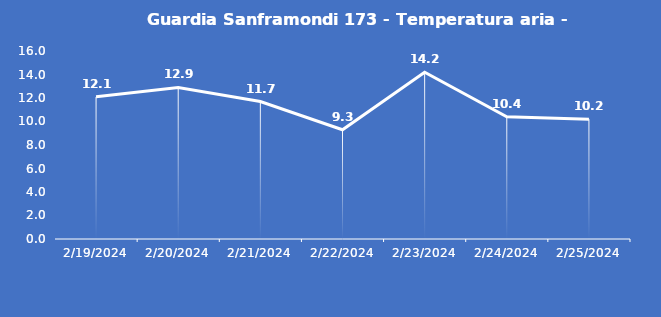
| Category | Guardia Sanframondi 173 - Temperatura aria - Grezzo (°C) |
|---|---|
| 2/19/24 | 12.1 |
| 2/20/24 | 12.9 |
| 2/21/24 | 11.7 |
| 2/22/24 | 9.3 |
| 2/23/24 | 14.2 |
| 2/24/24 | 10.4 |
| 2/25/24 | 10.2 |